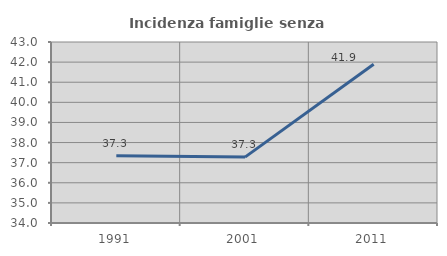
| Category | Incidenza famiglie senza nuclei |
|---|---|
| 1991.0 | 37.344 |
| 2001.0 | 37.276 |
| 2011.0 | 41.892 |